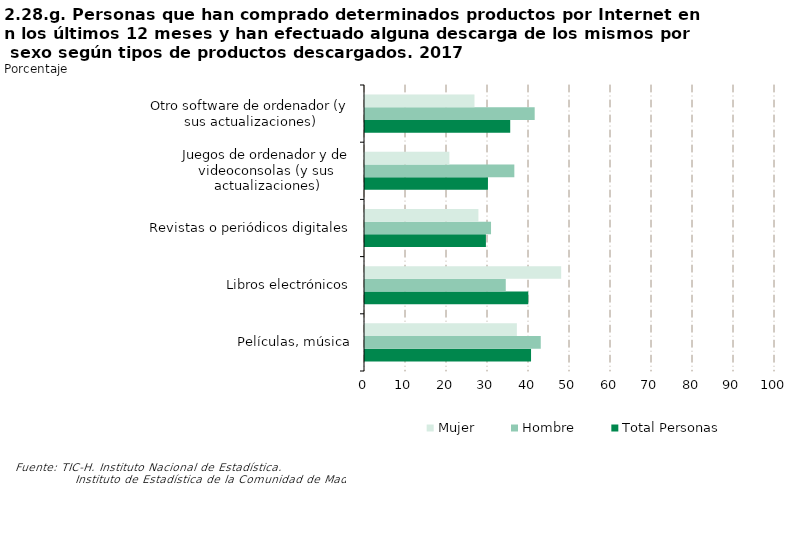
| Category | Total Personas | Hombre | Mujer |
|---|---|---|---|
| Películas, música | 40.499 | 42.867 | 37.037 |
| Libros electrónicos | 39.825 | 34.333 | 47.852 |
| Revistas o periódicos digitales | 29.489 | 30.739 | 27.663 |
| Juegos de ordenador y de videoconsolas (y sus actualizaciones) | 29.986 | 36.423 | 20.579 |
| Otro software de ordenador (y sus actualizaciones) | 35.42 | 41.385 | 26.701 |